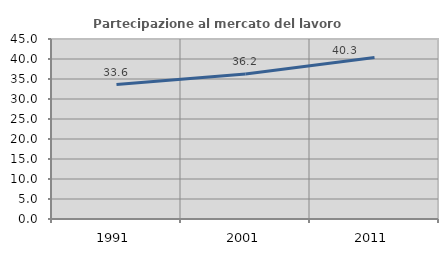
| Category | Partecipazione al mercato del lavoro  femminile |
|---|---|
| 1991.0 | 33.621 |
| 2001.0 | 36.235 |
| 2011.0 | 40.347 |